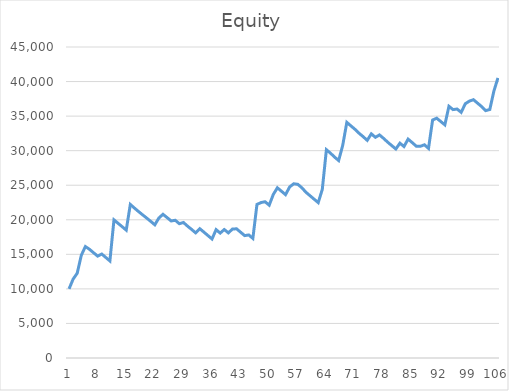
| Category | Equity |
|---|---|
| 0 | 10000 |
| 1 | 11414.05 |
| 2 | 12269.05 |
| 3 | 14857.05 |
| 4 | 16127.45 |
| 5 | 15727.45 |
| 6 | 15232.45 |
| 7 | 14744.05 |
| 8 | 15045.65 |
| 9 | 14545.65 |
| 10 | 14045.65 |
| 11 | 19988.15 |
| 12 | 19488.15 |
| 13 | 19001.95 |
| 14 | 18501.95 |
| 15 | 22221.95 |
| 16 | 21698.95 |
| 17 | 21198.95 |
| 18 | 20718.95 |
| 19 | 20248.55 |
| 20 | 19770.95 |
| 21 | 19270.95 |
| 22 | 20263.45 |
| 23 | 20794.45 |
| 24 | 20317.65 |
| 25 | 19829.65 |
| 26 | 19929.65 |
| 27 | 19429.65 |
| 28 | 19608.15 |
| 29 | 19085.15 |
| 30 | 18605.15 |
| 31 | 18109.15 |
| 32 | 18714.15 |
| 33 | 18219.15 |
| 34 | 17719.15 |
| 35 | 17219.15 |
| 36 | 18573.35 |
| 37 | 18073.35 |
| 38 | 18587.55 |
| 39 | 18107.55 |
| 40 | 18653.8 |
| 41 | 18697 |
| 42 | 18202 |
| 43 | 17707 |
| 44 | 17804 |
| 45 | 17304 |
| 46 | 22216.05 |
| 47 | 22491.25 |
| 48 | 22608.25 |
| 49 | 22113.25 |
| 50 | 23661.25 |
| 51 | 24629.25 |
| 52 | 24134.25 |
| 53 | 23634.25 |
| 54 | 24746.35 |
| 55 | 25210.1 |
| 56 | 25131.35 |
| 57 | 24631.35 |
| 58 | 23977.6 |
| 59 | 23477.6 |
| 60 | 22977.6 |
| 61 | 22482.6 |
| 62 | 24404.2 |
| 63 | 30139.6 |
| 64 | 29639.6 |
| 65 | 29073.6 |
| 66 | 28573.6 |
| 67 | 30779.65 |
| 68 | 34095.65 |
| 69 | 33589.55 |
| 70 | 33089.55 |
| 71 | 32520.55 |
| 72 | 32025.55 |
| 73 | 31492.6 |
| 74 | 32434.75 |
| 75 | 31934.75 |
| 76 | 32277.25 |
| 77 | 31777.25 |
| 78 | 31231.25 |
| 79 | 30736.25 |
| 80 | 30241.25 |
| 81 | 31085.25 |
| 82 | 30597.25 |
| 83 | 31673.25 |
| 84 | 31173.25 |
| 85 | 30650.25 |
| 86 | 30631.85 |
| 87 | 30851.05 |
| 88 | 30328.05 |
| 89 | 34436.05 |
| 90 | 34698.45 |
| 91 | 34218.45 |
| 92 | 33738.45 |
| 93 | 36421.65 |
| 94 | 35941.65 |
| 95 | 36024.85 |
| 96 | 35544.85 |
| 97 | 36790.45 |
| 98 | 37168.05 |
| 99 | 37376.85 |
| 100 | 36876.85 |
| 101 | 36384.85 |
| 102 | 35798.6 |
| 103 | 35953.6 |
| 104 | 38613.6 |
| 105 | 40527.35 |